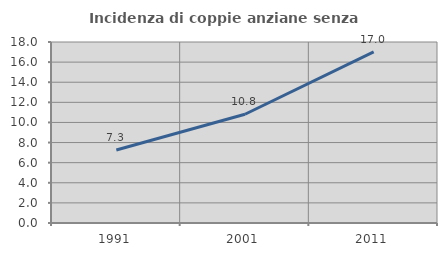
| Category | Incidenza di coppie anziane senza figli  |
|---|---|
| 1991.0 | 7.265 |
| 2001.0 | 10.815 |
| 2011.0 | 17.021 |